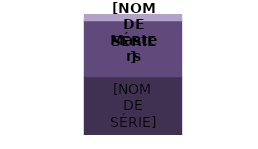
| Category | Bachelors | Masters | Autres |
|---|---|---|---|
| 0 | 1989 | 1901 | 210 |